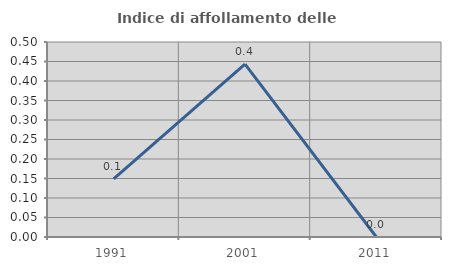
| Category | Indice di affollamento delle abitazioni  |
|---|---|
| 1991.0 | 0.149 |
| 2001.0 | 0.443 |
| 2011.0 | 0 |